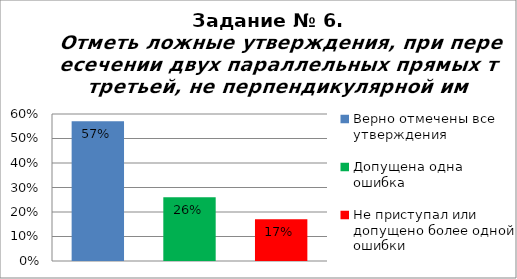
| Category | Отметь ложные утверждения, при пересечении двух параллельных прямых третьей, не перпендикулярной им. |
|---|---|
| Верно отмечены все утверждения | 0.57 |
| Допущена одна ошибка | 0.26 |
| Не приступал или допущено более одной ошибки | 0.17 |